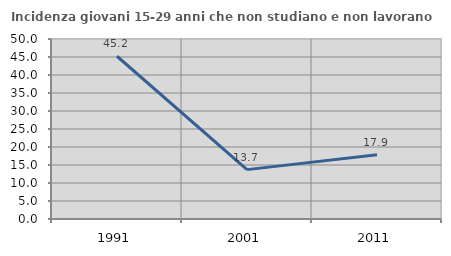
| Category | Incidenza giovani 15-29 anni che non studiano e non lavorano  |
|---|---|
| 1991.0 | 45.208 |
| 2001.0 | 13.718 |
| 2011.0 | 17.878 |